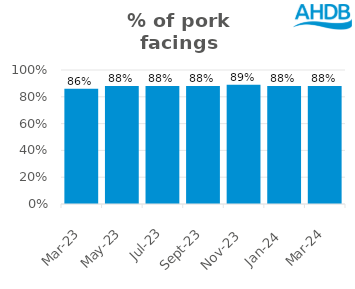
| Category | Pork |
|---|---|
| 2023-03-01 | 0.86 |
| 2023-05-01 | 0.88 |
| 2023-07-01 | 0.88 |
| 2023-09-01 | 0.88 |
| 2023-11-01 | 0.89 |
| 2024-01-01 | 0.88 |
| 2024-03-01 | 0.88 |